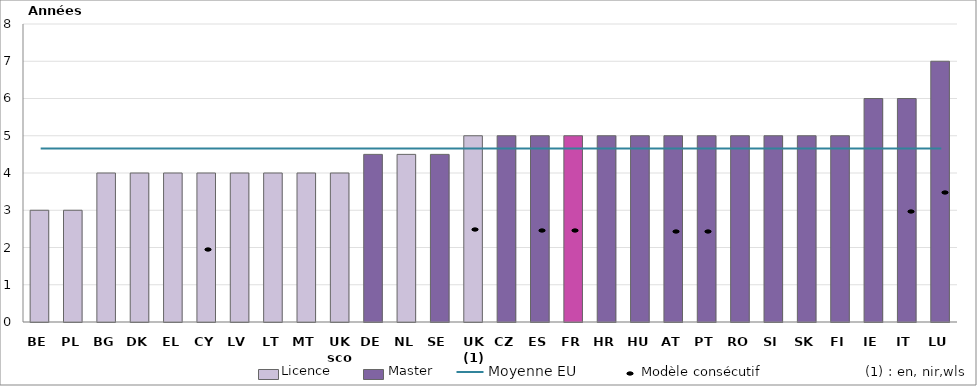
| Category | Durée FIE |
|---|---|
| 0 | 3 |
| 1 | 3 |
| 2 | 4 |
| 3 | 4 |
| 4 | 4 |
| 5 | 4 |
| 6 | 4 |
| 7 | 4 |
| 8 | 4 |
| 9 | 4 |
| 10 | 4.5 |
| 11 | 4.5 |
| 12 | 4.5 |
| 13 | 5 |
| 14 | 5 |
| 15 | 5 |
| 16 | 5 |
| 17 | 5 |
| 18 | 5 |
| 19 | 5 |
| 20 | 5 |
| 21 | 5 |
| 22 | 5 |
| 23 | 5 |
| 24 | 5 |
| 25 | 6 |
| 26 | 6 |
| 27 | 7 |